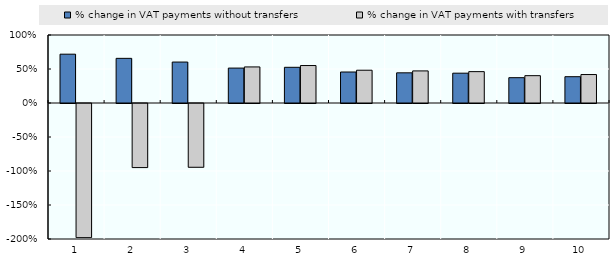
| Category | % change in VAT payments without transfers | % change in VAT payments with transfers |
|---|---|---|
| 1.0 | 0.718 | -1.973 |
| 2.0 | 0.656 | -0.942 |
| 3.0 | 0.602 | -0.938 |
| 4.0 | 0.513 | 0.53 |
| 5.0 | 0.525 | 0.551 |
| 6.0 | 0.456 | 0.482 |
| 7.0 | 0.444 | 0.472 |
| 8.0 | 0.439 | 0.461 |
| 9.0 | 0.372 | 0.402 |
| 10.0 | 0.387 | 0.419 |